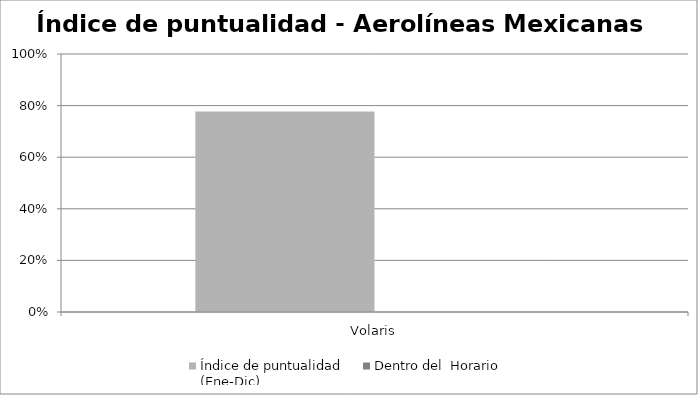
| Category | Índice de puntualidad
(Ene-Dic) | Dentro del  Horario |
|---|---|---|
| Volaris | 0.777 | 0 |